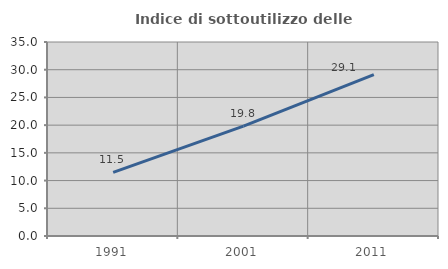
| Category | Indice di sottoutilizzo delle abitazioni  |
|---|---|
| 1991.0 | 11.484 |
| 2001.0 | 19.824 |
| 2011.0 | 29.132 |